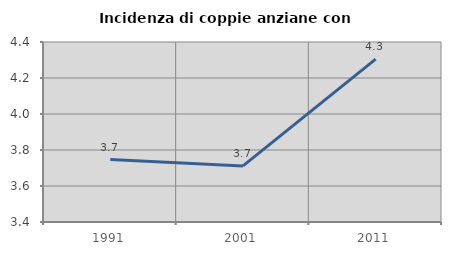
| Category | Incidenza di coppie anziane con figli |
|---|---|
| 1991.0 | 3.747 |
| 2001.0 | 3.712 |
| 2011.0 | 4.305 |